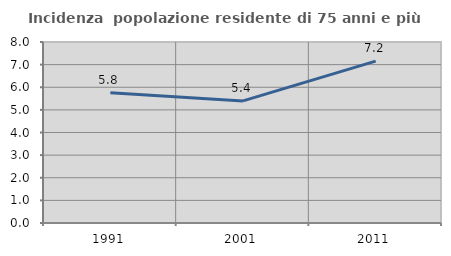
| Category | Incidenza  popolazione residente di 75 anni e più |
|---|---|
| 1991.0 | 5.755 |
| 2001.0 | 5.395 |
| 2011.0 | 7.157 |